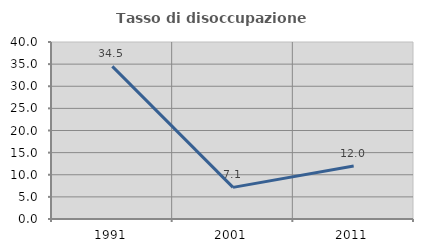
| Category | Tasso di disoccupazione giovanile  |
|---|---|
| 1991.0 | 34.483 |
| 2001.0 | 7.143 |
| 2011.0 | 12 |